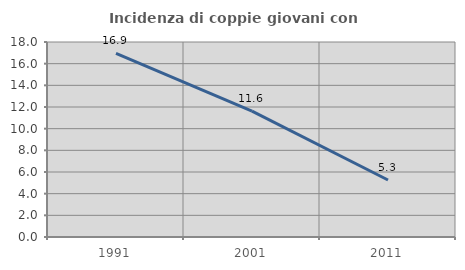
| Category | Incidenza di coppie giovani con figli |
|---|---|
| 1991.0 | 16.949 |
| 2001.0 | 11.618 |
| 2011.0 | 5.263 |